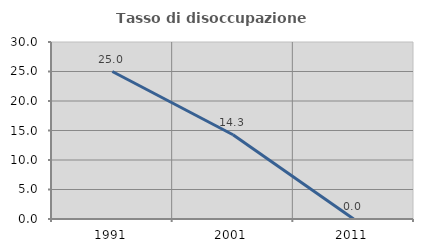
| Category | Tasso di disoccupazione giovanile  |
|---|---|
| 1991.0 | 25 |
| 2001.0 | 14.286 |
| 2011.0 | 0 |